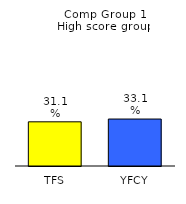
| Category | Series 0 |
|---|---|
| TFS | 0.311 |
| YFCY | 0.331 |